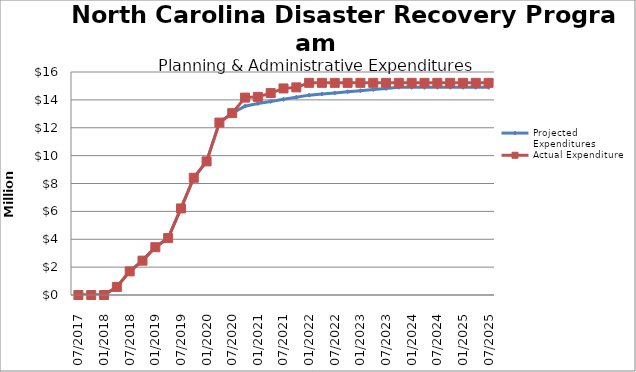
| Category | Projected Expenditures | Actual Expenditure |
|---|---|---|
| 07/2017 | 0 | 0 |
| 10/2017 | 0 | 0 |
| 01/2018 | 0 | 0 |
| 4/2018 | 578685.9 | 578685.9 |
| 07/2018 | 1695563.76 | 1695563.76 |
| 10/2018 | 2464354.82 | 2464354.82 |
| 01/2019 | 3428817.56 | 3428817.56 |
| 4/2019 | 4083338.56 | 4083338.56 |
| 07/2019 | 6210201.6 | 6210201.6 |
| 10/2019 | 8411874.6 | 8411874.6 |
| 01/2020 | 9585784.6 | 9585784.6 |
| 4/2020 | 12371382.6 | 12371382.6 |
| 07/2020 | 13048080.2 | 13048080.2 |
| 10/2020 | 13548080.2 | 14163213.99 |
| 01/2021 | 13739672.2 | 14215479.33 |
| 4/2021 | 13889672.2 | 14487603.62 |
| 07/2021 | 14039672.2 | 14820010.92 |
| 10/2021 | 14189672.2 | 14896224.38 |
| 01/2022 | 14339672.2 | 15222735.61 |
| 4/2022 | 14419672.2 | 15222877.07 |
| 07/2022 | 14499672.2 | 15222877.07 |
| 10/2022 | 14579672.2 | 15222877.07 |
| 01/2023 | 14659672.2 | 15222877.07 |
| 4/2023 | 14739672.2 | 15222877.07 |
| 07/2023 | 14819672.2 | 15222877.07 |
| 10/2023 | 14899672.2 | 15222877.07 |
| 01/2024 | 14899672.2 | 15222877.07 |
| 4/2024 | 14899672.2 | 15222877.07 |
| 07/2024 | 14899672.2 | 15222877.07 |
| 10/2024 | 14899672.2 | 15222877.07 |
| 01/2025 | 14899672.2 | 15222877.07 |
| 4/2025 | 14899672.2 | 15222877.07 |
| 07/2025 | 14899672.2 | 15222877.07 |